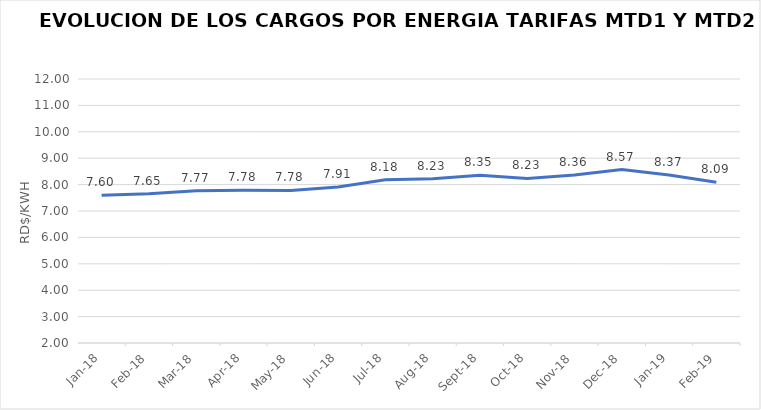
| Category | Series 0 |
|---|---|
| 2018-01-01 | 7.597 |
| 2018-02-01 | 7.65 |
| 2018-03-01 | 7.766 |
| 2018-04-01 | 7.782 |
| 2018-05-01 | 7.78 |
| 2018-06-01 | 7.912 |
| 2018-07-01 | 8.181 |
| 2018-08-01 | 8.226 |
| 2018-09-01 | 8.355 |
| 2018-10-01 | 8.234 |
| 2018-11-01 | 8.36 |
| 2018-12-01 | 8.57 |
| 2019-01-01 | 8.367 |
| 2019-02-01 | 8.093 |